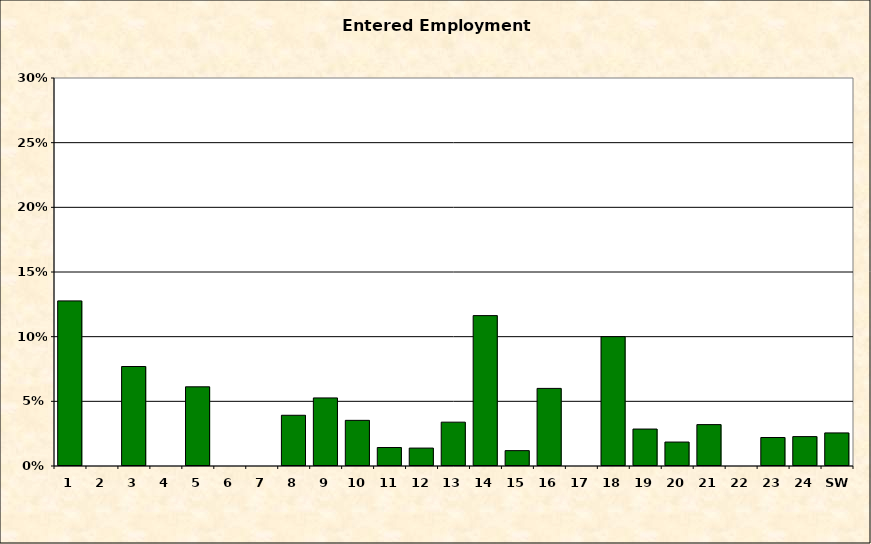
| Category | Entered Employment Rate |
|---|---|
| 1 | 0.128 |
| 2 | 0 |
| 3 | 0.077 |
| 4 | 0 |
| 5 | 0.061 |
| 6 | 0 |
| 7 | 0 |
| 8 | 0.039 |
| 9 | 0.053 |
| 10 | 0.035 |
| 11 | 0.014 |
| 12 | 0.014 |
| 13 | 0.034 |
| 14 | 0.116 |
| 15 | 0.012 |
| 16 | 0.06 |
| 17 | 0 |
| 18 | 0.1 |
| 19 | 0.029 |
| 20 | 0.019 |
| 21 | 0.032 |
| 22 | 0 |
| 23 | 0.022 |
| 24 | 0.023 |
| SW | 0.026 |